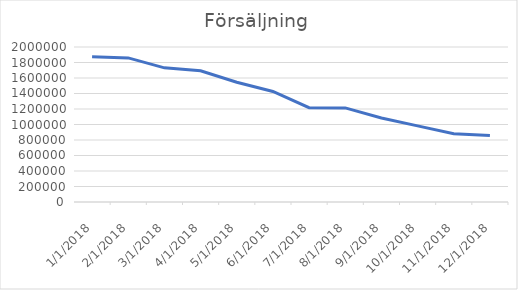
| Category | Försäljning |
|---|---|
| 1/1/18 | 1874005.261 |
| 2/1/18 | 1859182.996 |
| 3/1/18 | 1730856.448 |
| 4/1/18 | 1693485.684 |
| 5/1/18 | 1545407.543 |
| 6/1/18 | 1425781.037 |
| 7/1/18 | 1217130.153 |
| 8/1/18 | 1214370.221 |
| 9/1/18 | 1083337.92 |
| 10/1/18 | 982056 |
| 11/1/18 | 880000 |
| 12/1/18 | 856800 |